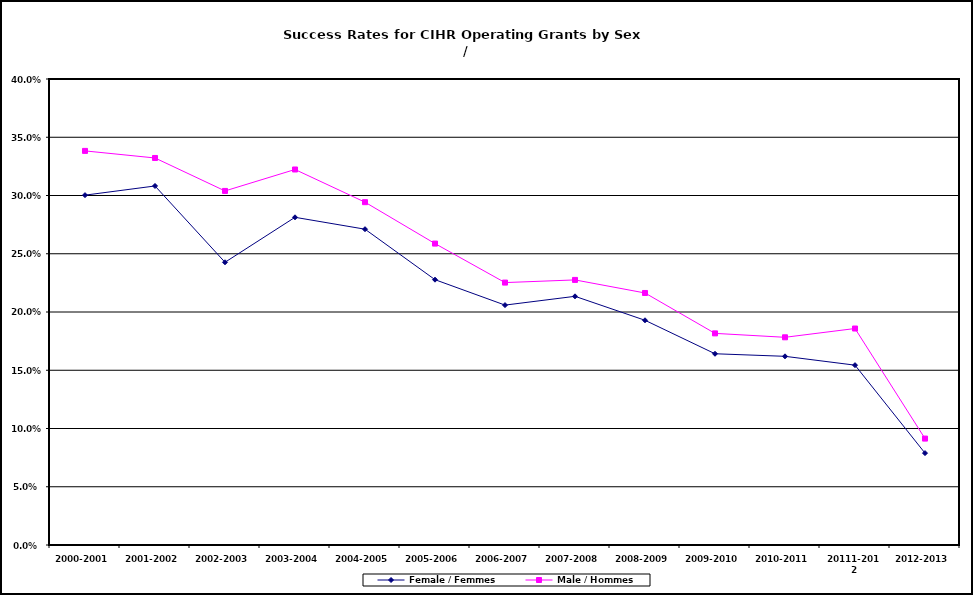
| Category | Female / Femmes | Male / Hommes |
|---|---|---|
| 2000-2001 | 0.3 | 0.338 |
| 2001-2002 | 0.308 | 0.332 |
| 2002-2003 | 0.243 | 0.304 |
| 2003-2004 | 0.281 | 0.322 |
| 2004-2005 | 0.271 | 0.294 |
| 2005-2006 | 0.228 | 0.259 |
| 2006-2007 | 0.206 | 0.225 |
| 2007-2008 | 0.213 | 0.228 |
| 2008-2009 | 0.193 | 0.216 |
| 2009-2010 | 0.164 | 0.182 |
| 2010-2011 | 0.162 | 0.178 |
| 20111-2012 | 0.154 | 0.186 |
| 2012-2013 | 0.079 | 0.091 |